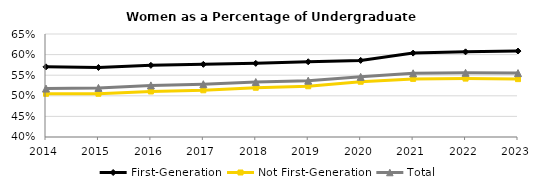
| Category | First-Generation | Not First-Generation | Total |
|---|---|---|---|
| 2014.0 | 0.57 | 0.505 | 0.518 |
| 2015.0 | 0.569 | 0.505 | 0.519 |
| 2016.0 | 0.574 | 0.51 | 0.525 |
| 2017.0 | 0.576 | 0.513 | 0.528 |
| 2018.0 | 0.579 | 0.52 | 0.533 |
| 2019.0 | 0.583 | 0.523 | 0.537 |
| 2020.0 | 0.586 | 0.534 | 0.546 |
| 2021.0 | 0.604 | 0.541 | 0.555 |
| 2022.0 | 0.607 | 0.542 | 0.556 |
| 2023.0 | 0.609 | 0.54 | 0.555 |